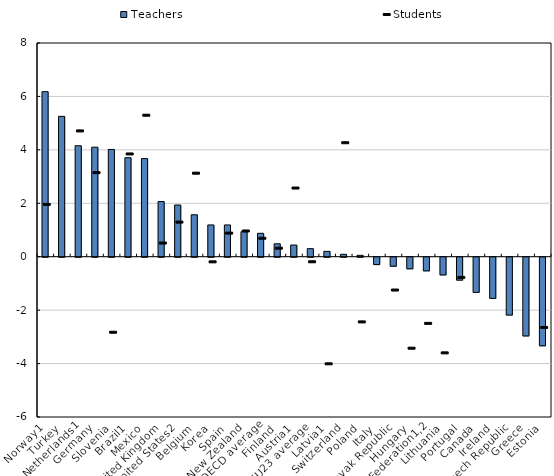
| Category | Teachers |
|---|---|
| Norway1 | 6.177 |
| Turkey | 5.254 |
| Netherlands1 | 4.154 |
| Germany | 4.1 |
| Slovenia | 4.016 |
| Brazil1 | 3.706 |
| Mexico | 3.674 |
| United Kingdom | 2.065 |
| United States2 | 1.935 |
| Belgium | 1.569 |
| Korea | 1.189 |
| Spain | 1.189 |
| New Zealand | 0.936 |
| OECD average | 0.877 |
| Finland | 0.483 |
| Austria1 | 0.438 |
| EU23 average | 0.301 |
| Latvia1 | 0.201 |
| Switzerland | 0.09 |
| Poland | 0.052 |
| Italy | -0.276 |
| Slovak Republic | -0.337 |
| Hungary | -0.435 |
| Russian Federation1,2 | -0.511 |
| Lithuania | -0.663 |
| Portugal | -0.858 |
| Canada | -1.316 |
| Ireland | -1.541 |
| Czech Republic | -2.165 |
| Greece | -2.948 |
| Estonia | -3.317 |